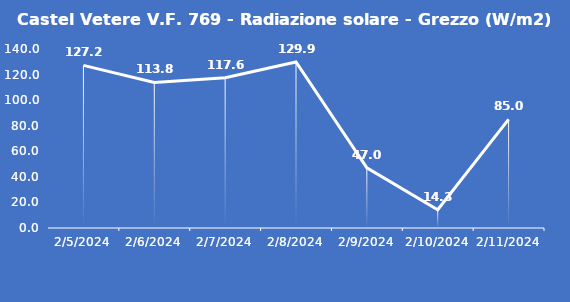
| Category | Castel Vetere V.F. 769 - Radiazione solare - Grezzo (W/m2) |
|---|---|
| 2/5/24 | 127.2 |
| 2/6/24 | 113.8 |
| 2/7/24 | 117.6 |
| 2/8/24 | 129.9 |
| 2/9/24 | 47 |
| 2/10/24 | 14.3 |
| 2/11/24 | 85 |